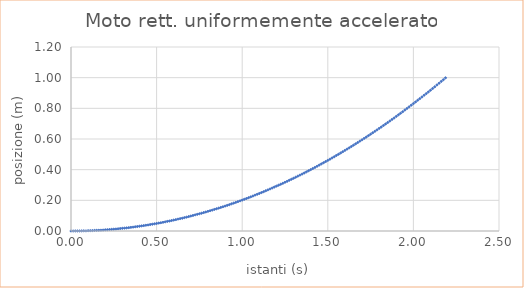
| Category | Series 0 |
|---|---|
| 0.0 | 0 |
| 0.0125 | 0 |
| 0.025 | 0 |
| 0.037500000000000006 | 0 |
| 0.05 | 0 |
| 0.0625 | 0.001 |
| 0.07500000000000001 | 0.001 |
| 0.08750000000000001 | 0.001 |
| 0.1 | 0.002 |
| 0.1125 | 0.002 |
| 0.125 | 0.003 |
| 0.1375 | 0.004 |
| 0.15000000000000002 | 0.004 |
| 0.1625 | 0.005 |
| 0.17500000000000002 | 0.005 |
| 0.1875 | 0.006 |
| 0.2 | 0.008 |
| 0.21250000000000002 | 0.008 |
| 0.225 | 0.01 |
| 0.23750000000000002 | 0.011 |
| 0.25 | 0.012 |
| 0.2625 | 0.013 |
| 0.275 | 0.015 |
| 0.28750000000000003 | 0.016 |
| 0.30000000000000004 | 0.018 |
| 0.3125 | 0.019 |
| 0.325 | 0.02 |
| 0.3375 | 0.022 |
| 0.35000000000000003 | 0.024 |
| 0.36250000000000004 | 0.025 |
| 0.375 | 0.028 |
| 0.3875 | 0.029 |
| 0.4 | 0.031 |
| 0.41250000000000003 | 0.033 |
| 0.42500000000000004 | 0.035 |
| 0.4375 | 0.037 |
| 0.45 | 0.039 |
| 0.4625 | 0.042 |
| 0.47500000000000003 | 0.044 |
| 0.48750000000000004 | 0.047 |
| 0.5 | 0.049 |
| 0.5125000000000001 | 0.052 |
| 0.525 | 0.054 |
| 0.5375 | 0.057 |
| 0.55 | 0.06 |
| 0.5625 | 0.063 |
| 0.5750000000000001 | 0.065 |
| 0.5875 | 0.068 |
| 0.6000000000000001 | 0.071 |
| 0.6125 | 0.074 |
| 0.625 | 0.078 |
| 0.6375000000000001 | 0.081 |
| 0.65 | 0.083 |
| 0.6625000000000001 | 0.087 |
| 0.675 | 0.09 |
| 0.6875 | 0.094 |
| 0.7000000000000001 | 0.098 |
| 0.7125 | 0.101 |
| 0.7250000000000001 | 0.105 |
| 0.7375 | 0.109 |
| 0.75 | 0.112 |
| 0.7625000000000001 | 0.116 |
| 0.775 | 0.12 |
| 0.7875000000000001 | 0.124 |
| 0.8 | 0.128 |
| 0.8125 | 0.132 |
| 0.8250000000000001 | 0.136 |
| 0.8375 | 0.141 |
| 0.8500000000000001 | 0.145 |
| 0.8625 | 0.149 |
| 0.875 | 0.154 |
| 0.8875000000000001 | 0.158 |
| 0.9 | 0.163 |
| 0.9125000000000001 | 0.167 |
| 0.925 | 0.172 |
| 0.9375 | 0.177 |
| 0.9500000000000001 | 0.182 |
| 0.9625 | 0.187 |
| 0.9750000000000001 | 0.192 |
| 0.9875 | 0.197 |
| 1.0 | 0.202 |
| 1.0125 | 0.207 |
| 1.0250000000000001 | 0.212 |
| 1.0375 | 0.217 |
| 1.05 | 0.223 |
| 1.0625 | 0.228 |
| 1.075 | 0.234 |
| 1.0875000000000001 | 0.239 |
| 1.1 | 0.245 |
| 1.1125 | 0.251 |
| 1.125 | 0.256 |
| 1.1375 | 0.262 |
| 1.1500000000000001 | 0.268 |
| 1.1625 | 0.274 |
| 1.175 | 0.28 |
| 1.1875 | 0.287 |
| 1.2000000000000002 | 0.293 |
| 1.2125000000000001 | 0.299 |
| 1.225 | 0.305 |
| 1.2375 | 0.311 |
| 1.25 | 0.318 |
| 1.2625000000000002 | 0.324 |
| 1.2750000000000001 | 0.331 |
| 1.2875 | 0.337 |
| 1.3 | 0.344 |
| 1.3125 | 0.351 |
| 1.3250000000000002 | 0.358 |
| 1.3375000000000001 | 0.365 |
| 1.35 | 0.371 |
| 1.3625 | 0.378 |
| 1.375 | 0.386 |
| 1.3875000000000002 | 0.393 |
| 1.4000000000000001 | 0.4 |
| 1.4125 | 0.407 |
| 1.425 | 0.415 |
| 1.4375 | 0.422 |
| 1.4500000000000002 | 0.43 |
| 1.4625000000000001 | 0.438 |
| 1.475 | 0.445 |
| 1.4875 | 0.453 |
| 1.5 | 0.461 |
| 1.5125000000000002 | 0.468 |
| 1.5250000000000001 | 0.477 |
| 1.5375 | 0.484 |
| 1.55 | 0.493 |
| 1.5625 | 0.5 |
| 1.5750000000000002 | 0.509 |
| 1.5875000000000001 | 0.517 |
| 1.6 | 0.526 |
| 1.6125 | 0.534 |
| 1.625 | 0.542 |
| 1.6375000000000002 | 0.551 |
| 1.6500000000000001 | 0.56 |
| 1.6625 | 0.568 |
| 1.675 | 0.577 |
| 1.6875 | 0.586 |
| 1.7000000000000002 | 0.595 |
| 1.7125000000000001 | 0.604 |
| 1.725 | 0.613 |
| 1.7375 | 0.622 |
| 1.75 | 0.631 |
| 1.7625000000000002 | 0.641 |
| 1.7750000000000001 | 0.65 |
| 1.7875 | 0.66 |
| 1.8 | 0.669 |
| 1.8125 | 0.678 |
| 1.8250000000000002 | 0.688 |
| 1.8375000000000001 | 0.698 |
| 1.85 | 0.708 |
| 1.8625 | 0.717 |
| 1.875 | 0.728 |
| 1.8875000000000002 | 0.737 |
| 1.9000000000000001 | 0.748 |
| 1.9125 | 0.758 |
| 1.925 | 0.768 |
| 1.9375 | 0.778 |
| 1.9500000000000002 | 0.789 |
| 1.9625000000000001 | 0.799 |
| 1.975 | 0.81 |
| 1.9875 | 0.821 |
| 2.0 | 0.831 |
| 2.0125 | 0.842 |
| 2.025 | 0.853 |
| 2.0375 | 0.863 |
| 2.0500000000000003 | 0.874 |
| 2.0625 | 0.885 |
| 2.075 | 0.896 |
| 2.0875 | 0.907 |
| 2.1 | 0.918 |
| 2.1125000000000003 | 0.93 |
| 2.125 | 0.941 |
| 2.1375 | 0.953 |
| 2.15 | 0.964 |
| 2.1625 | 0.976 |
| 2.1750000000000003 | 0.987 |
| 2.1875 | 0.999 |